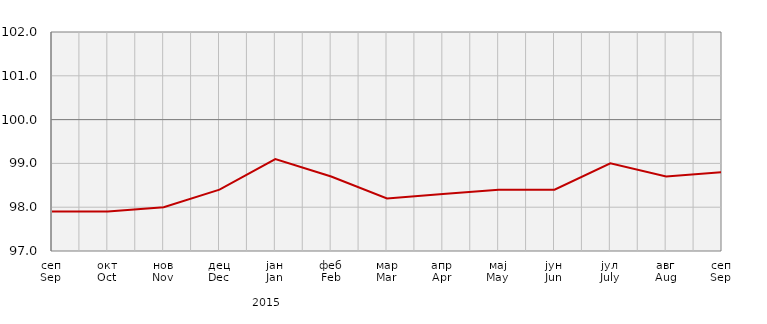
| Category | Индекси потрошачких цијена
Consumer price indices |
|---|---|
| сеп
Sep | 97.9 |
| окт
Oct | 97.9 |
| нов
Nov | 98 |
| дец
Dec | 98.4 |
| јан
Jan | 99.1 |
| феб
Feb | 98.7 |
| мар
Mar | 98.2 |
| апр
Apr | 98.3 |
| мај
May | 98.4 |
| јун
Jun | 98.4 |
| јул
July | 99 |
| авг
Aug | 98.7 |
| сеп
Sep | 98.8 |